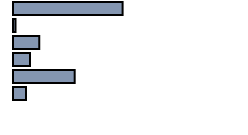
| Category | Series 0 |
|---|---|
| 0 | 47.652 |
| 1 | 1.136 |
| 2 | 11.439 |
| 3 | 7.348 |
| 4 | 26.818 |
| 5 | 5.606 |
| 6 | 0 |